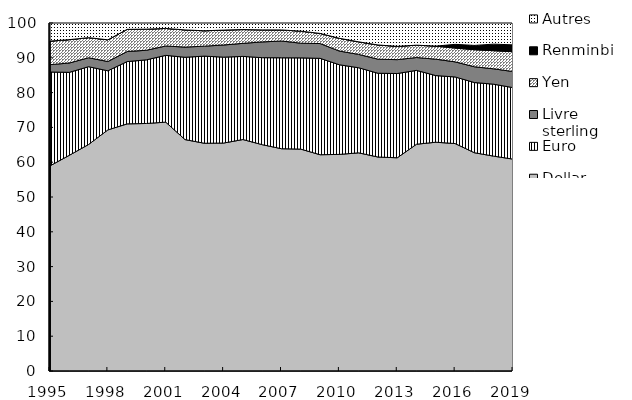
| Category | Dollar | Euro | Livre sterling | Yen  | Renminbi | Autres |
|---|---|---|---|---|---|---|
| 1995 | 58.958 | 26.955 | 2.113 | 6.769 | 0 | 5.205 |
| 1996 | 61.983 | 23.84 | 2.682 | 6.712 | 0 | 4.783 |
| 1997 | 65.098 | 22.34 | 2.58 | 5.771 | 0 | 4.21 |
| 1998 | 69.281 | 16.986 | 2.662 | 6.239 | 0 | 4.833 |
| 1999 | 71.014 | 17.899 | 2.887 | 6.374 | 0 | 1.827 |
| 2000 | 71.129 | 18.29 | 2.753 | 6.065 | 0 | 1.762 |
| 2001 | 71.515 | 19.183 | 2.701 | 5.044 | 0 | 1.557 |
| 2002 | 66.501 | 23.65 | 2.922 | 4.941 | 0 | 1.986 |
| 2003 | 65.45 | 25.033 | 2.861 | 4.424 | 0 | 2.232 |
| 2004 | 65.507 | 24.68 | 3.493 | 4.284 | 0 | 2.037 |
| 2005 | 66.515 | 23.89 | 3.747 | 3.96 | 0 | 1.888 |
| 2006 | 65.044 | 24.995 | 4.52 | 3.461 | 0 | 1.98 |
| 2007 | 63.875 | 26.133 | 4.824 | 3.178 | 0 | 1.99 |
| 2008 | 63.765 | 26.214 | 4.218 | 3.467 | 0 | 2.335 |
| 2009 | 62.146 | 27.701 | 4.253 | 2.902 | 0 | 2.999 |
| 2010 | 62.242 | 25.756 | 3.941 | 3.663 | 0 | 4.398 |
| 2011 | 62.695 | 24.443 | 3.838 | 3.613 | 0 | 5.411 |
| 2012 | 61.493 | 24.067 | 4.042 | 4.089 | 0 | 6.309 |
| 2013 | 61.27 | 24.21 | 3.987 | 3.824 | 0 | 6.709 |
| 2014 | 65.167 | 21.211 | 3.703 | 3.545 | 0 | 6.373 |
| 2015 | 65.746 | 19.145 | 4.717 | 3.754 | 0 | 6.639 |
| 2016 | 65.357 | 19.135 | 4.337 | 3.964 | 1.073 | 6.134 |
| 2017 | 62.725 | 20.166 | 4.535 | 4.904 | 1.233 | 6.436 |
| 2018 | 61.744 | 20.671 | 4.42 | 5.199 | 1.893 | 6.073 |
| 2019 | 60.89 | 20.544 | 4.62 | 5.7 | 1.965 | 6.282 |